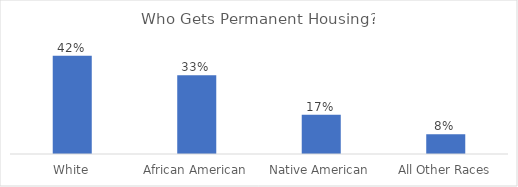
| Category | Series 0 |
|---|---|
| White | 0.417 |
| African American | 0.333 |
| Native American | 0.167 |
| All Other Races | 0.083 |